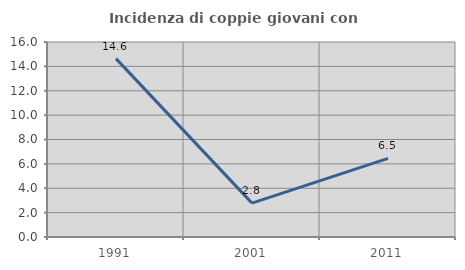
| Category | Incidenza di coppie giovani con figli |
|---|---|
| 1991.0 | 14.634 |
| 2001.0 | 2.778 |
| 2011.0 | 6.452 |